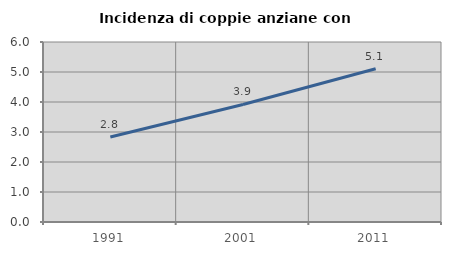
| Category | Incidenza di coppie anziane con figli |
|---|---|
| 1991.0 | 2.834 |
| 2001.0 | 3.918 |
| 2011.0 | 5.109 |